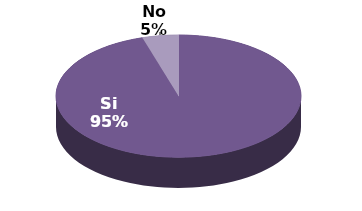
| Category | Series 1 |
|---|---|
| Si | 20 |
| No | 1 |